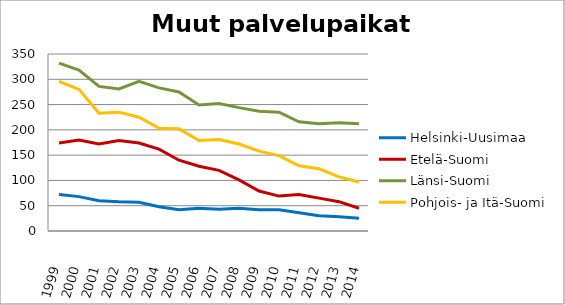
| Category | Helsinki-Uusimaa | Etelä-Suomi | Länsi-Suomi | Pohjois- ja Itä-Suomi |
|---|---|---|---|---|
| 1999.0 | 72 | 174 | 332 | 296 |
| 2000.0 | 68 | 180 | 318 | 280 |
| 2001.0 | 60 | 172 | 286 | 233 |
| 2002.0 | 58 | 179 | 281 | 235 |
| 2003.0 | 57 | 174 | 296 | 225 |
| 2004.0 | 48 | 162 | 283 | 203 |
| 2005.0 | 42 | 140 | 275 | 202 |
| 2006.0 | 45 | 128 | 249 | 179 |
| 2007.0 | 43 | 120 | 252 | 181 |
| 2008.0 | 45 | 101 | 244 | 172 |
| 2009.0 | 42 | 79 | 237 | 158 |
| 2010.0 | 42 | 69 | 235 | 149 |
| 2011.0 | 36 | 72 | 216 | 129 |
| 2012.0 | 30 | 65 | 212 | 123 |
| 2013.0 | 28 | 58 | 214 | 107 |
| 2014.0 | 25 | 45 | 212 | 97 |